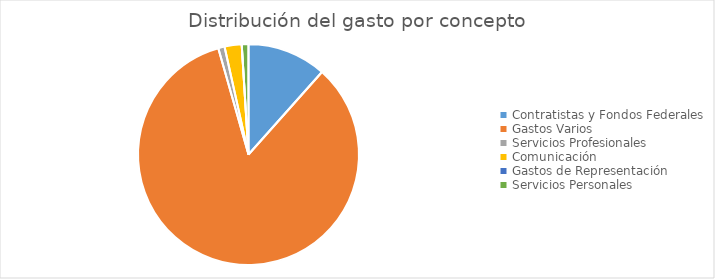
| Category | Series 0 |
|---|---|
| Contratistas y Fondos Federales | 50933519.66 |
| Gastos Varios | 369517127.43 |
| Servicios Profesionales | 4078080.86 |
| Comunicación | 10998972.2 |
| Gastos de Representación | 0 |
| Servicios Personales | 4320399.77 |